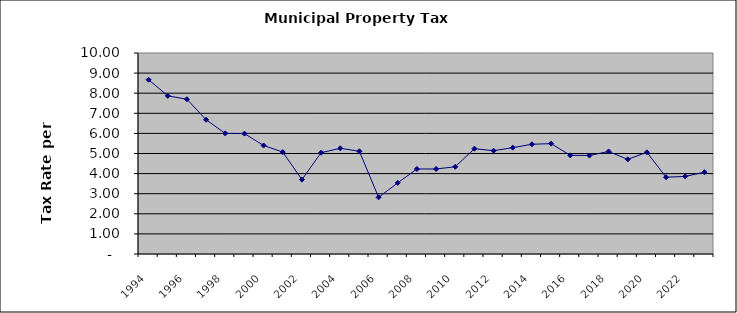
| Category | Rate |
|---|---|
| 1994.0 | 8.67 |
| 1995.0 | 7.87 |
| 1996.0 | 7.7 |
| 1997.0 | 6.68 |
| 1998.0 | 6 |
| 1999.0 | 5.99 |
| 2000.0 | 5.4 |
| 2001.0 | 5.07 |
| 2002.0 | 3.7 |
| 2003.0 | 5.04 |
| 2004.0 | 5.26 |
| 2005.0 | 5.11 |
| 2006.0 | 2.82 |
| 2007.0 | 3.54 |
| 2008.0 | 4.23 |
| 2009.0 | 4.23 |
| 2010.0 | 4.34 |
| 2011.0 | 5.24 |
| 2012.0 | 5.14 |
| 2013.0 | 5.29 |
| 2014.0 | 5.46 |
| 2015.0 | 5.49 |
| 2016.0 | 4.91 |
| 2017.0 | 4.9 |
| 2018.0 | 5.1 |
| 2019.0 | 4.71 |
| 2020.0 | 5.06 |
| 2021.0 | 3.82 |
| 2022.0 | 3.86 |
| 2023.0 | 4.07 |